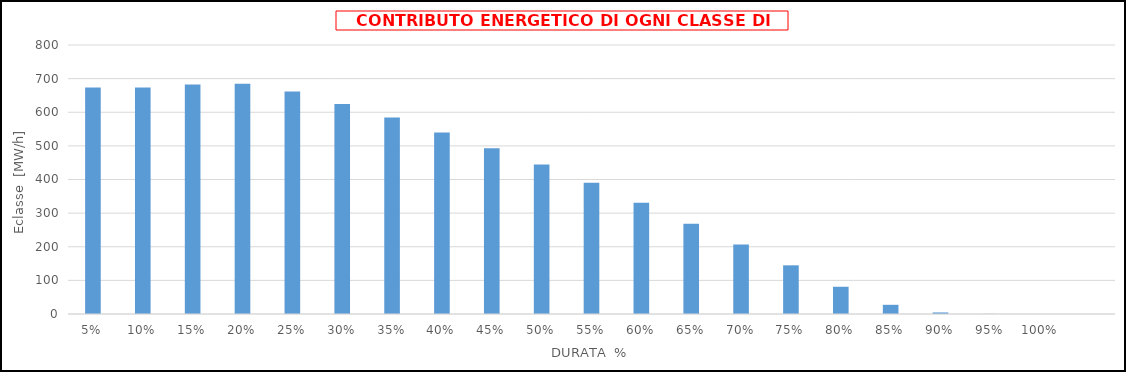
| Category | Eclasse |
|---|---|
| 0.05 | 673.372 |
| 0.1 | 673.372 |
| 0.15 | 682.334 |
| 0.2 | 684.993 |
| 0.25 | 662.047 |
| 0.3 | 624.844 |
| 0.35 | 584.352 |
| 0.4 | 539.801 |
| 0.45 | 492.653 |
| 0.5 | 444.714 |
| 0.55 | 390.469 |
| 0.6 | 330.499 |
| 0.65 | 268.748 |
| 0.7 | 206.849 |
| 0.75 | 144.768 |
| 0.8 | 81.013 |
| 0.85 | 27.342 |
| 0.9 | 4.627 |
| 0.95 | 0.291 |
| 1.0 | 0 |